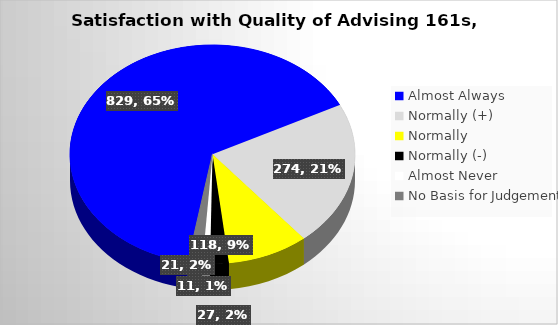
| Category | Series 0 |
|---|---|
| Almost Always | 829 |
| Normally (+) | 274 |
| Normally  | 118 |
| Normally (-) | 27 |
| Almost Never | 11 |
| No Basis for Judgement | 21 |